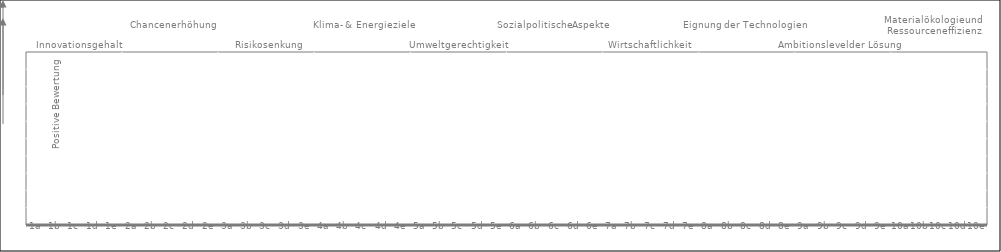
| Category | MW minus STABW | doppelte STABW |
|---|---|---|
| 0 | 0 | 0 |
| 1 | 0 | 0 |
| 2 | 0 | 0 |
| 3 | 0 | 0 |
| 4 | 0 | 0 |
| 5 | 0 | 0 |
| 6 | 0 | 0 |
| 7 | 0 | 0 |
| 8 | 0 | 0 |
| 9 | 0 | 0 |
| 10 | 0 | 0 |
| 11 | 0 | 0 |
| 12 | 0 | 0 |
| 13 | 0 | 0 |
| 14 | 0 | 0 |
| 15 | 0 | 0 |
| 16 | 0 | 0 |
| 17 | 0 | 0 |
| 18 | 0 | 0 |
| 19 | 0 | 0 |
| 20 | 0 | 0 |
| 21 | 0 | 0 |
| 22 | 0 | 0 |
| 23 | 0 | 0 |
| 24 | 0 | 0 |
| 25 | 0 | 0 |
| 26 | 0 | 0 |
| 27 | 0 | 0 |
| 28 | 0 | 0 |
| 29 | 0 | 0 |
| 30 | 0 | 0 |
| 31 | 0 | 0 |
| 32 | 0 | 0 |
| 33 | 0 | 0 |
| 34 | 0 | 0 |
| 35 | 0 | 0 |
| 36 | 0 | 0 |
| 37 | 0 | 0 |
| 38 | 0 | 0 |
| 39 | 0 | 0 |
| 40 | 0 | 0 |
| 41 | 0 | 0 |
| 42 | 0 | 0 |
| 43 | 0 | 0 |
| 44 | 0 | 0 |
| 45 | 0 | 0 |
| 46 | 0 | 0 |
| 47 | 0 | 0 |
| 48 | 0 | 0 |
| 49 | 0 | 0 |